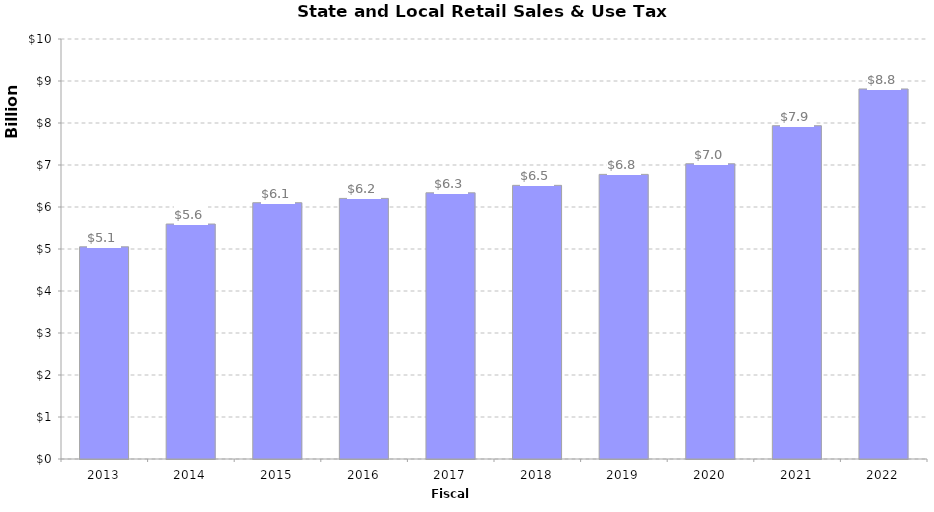
| Category | Series 0 |
|---|---|
| 2013.0 | 5052117000 |
| 2014.0 | 5594644000 |
| 2015.0 | 6102277000 |
| 2016.0 | 6204518000 |
| 2017.0 | 6337800000 |
| 2018.0 | 6515598000 |
| 2019.0 | 6776635000 |
| 2020.0 | 7029632000 |
| 2021.0 | 7935765000 |
| 2022.0 | 8810274000 |